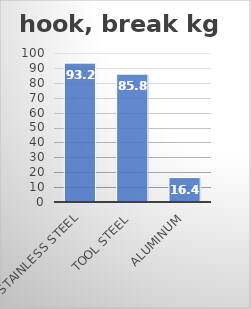
| Category | hook, break kg |
|---|---|
| Stainless Steel | 93.2 |
| Tool Steel | 85.8 |
| Aluminum | 16.4 |